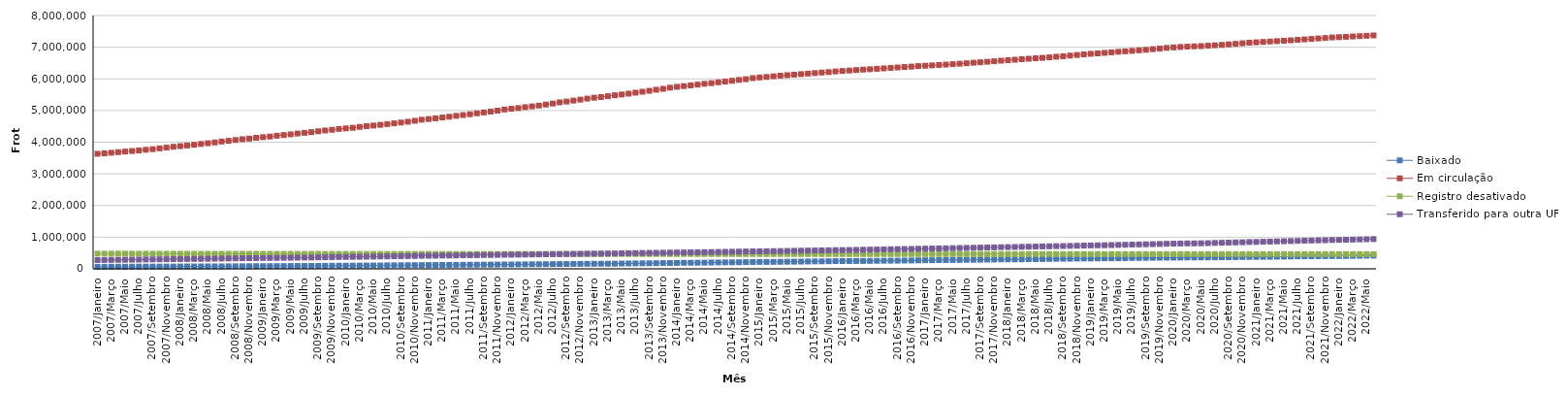
| Category | Baixado | Em circulação | Registro desativado | Transferido para outra UF |
|---|---|---|---|---|
| 2007/Janeiro | 64547 | 3632913 | 479318 | 276848 |
| 2007/Fevereiro | 64806 | 3648229 | 479069 | 278589 |
| 2007/Março | 65958 | 3666330 | 478732 | 281336 |
| 2007/Abril | 67104 | 3684659 | 478408 | 283482 |
| 2007/Maio | 67910 | 3703105 | 478111 | 286287 |
| 2007/Junho | 68357 | 3720760 | 477892 | 288677 |
| 2007/Julho | 68833 | 3740144 | 477650 | 291392 |
| 2007/Agosto | 69889 | 3760626 | 477365 | 294747 |
| 2007/Setembro | 70132 | 3780102 | 477124 | 297430 |
| 2007/Outubro | 71287 | 3804917 | 476840 | 300329 |
| 2007/Novembro | 72361 | 3829566 | 476562 | 302820 |
| 2007/Dezembro | 73891 | 3855215 | 476328 | 306596 |
| 2008/Janeiro | 74340 | 3875255 | 476076 | 308112 |
| 2008/Fevereiro | 75353 | 3894762 | 475708 | 310477 |
| 2008/Março | 75675 | 3918034 | 475517 | 313000 |
| 2008/Abril | 76548 | 3943442 | 475316 | 315593 |
| 2008/Maio | 77484 | 3966525 | 475140 | 318190 |
| 2008/Junho | 78077 | 3992143 | 474958 | 320898 |
| 2008/Julho | 78582 | 4020226 | 474670 | 324495 |
| 2008/Agosto | 79818 | 4043489 | 474450 | 327629 |
| 2008/Setembro | 81417 | 4069023 | 474182 | 330807 |
| 2008/Outubro | 82541 | 4093300 | 473971 | 333813 |
| 2008/Novembro | 84019 | 4112490 | 473775 | 336412 |
| 2008/Dezembro | 85156 | 4138550 | 473621 | 339835 |
| 2009/Janeiro | 85589 | 4157957 | 473439 | 341229 |
| 2009/Fevereiro | 85810 | 4177472 | 473325 | 342951 |
| 2009/Março | 86786 | 4203850 | 473151 | 345339 |
| 2009/Abril | 87201 | 4226174 | 473036 | 347728 |
| 2009/Maio | 88580 | 4247794 | 472889 | 350429 |
| 2009/Junho | 90837 | 4272968 | 472709 | 353099 |
| 2009/Julho | 92104 | 4294709 | 472576 | 356443 |
| 2009/Agosto | 92510 | 4317141 | 472442 | 359402 |
| 2009/Setembro | 94082 | 4344058 | 472278 | 362303 |
| 2009/Outubro | 95054 | 4369013 | 472137 | 365574 |
| 2009/Novembro | 97424 | 4390432 | 471956 | 368724 |
| 2009/Dezembro | 99897 | 4417646 | 471836 | 372932 |
| 2010/Janeiro | 100722 | 4435639 | 471726 | 374770 |
| 2010/Fevereiro | 101738 | 4453986 | 471639 | 377118 |
| 2010/Março | 103557 | 4483084 | 471523 | 380165 |
| 2010/Abril | 104790 | 4505426 | 471431 | 383245 |
| 2010/Maio | 106349 | 4525363 | 471326 | 386624 |
| 2010/Junho | 107893 | 4547457 | 471216 | 389555 |
| 2010/Julho | 110156 | 4570518 | 471118 | 392864 |
| 2010/Agosto | 112074 | 4594873 | 470979 | 396734 |
| 2010/Setembro | 113505 | 4620313 | 470821 | 400123 |
| 2010/Outubro | 115321 | 4645888 | 470695 | 403353 |
| 2010/Novembro | 116797 | 4674932 | 470572 | 406552 |
| 2010/Dezembro | 118610 | 4709614 | 470476 | 410966 |
| 2011/Janeiro | 119458 | 4730853 | 470334 | 412560 |
| 2011/Fevereiro | 120721 | 4753292 | 470223 | 415130 |
| 2011/Março | 122631 | 4779798 | 470113 | 417798 |
| 2011/Abril | 124288 | 4803932 | 469981 | 420366 |
| 2011/Maio | 126038 | 4830913 | 469848 | 423329 |
| 2011/Junho | 127706 | 4856554 | 469761 | 426350 |
| 2011/Julho | 129434 | 4882122 | 469687 | 429306 |
| 2011/Agosto | 131102 | 4911137 | 469586 | 432603 |
| 2011/Setembro | 132166 | 4939244 | 469509 | 435378 |
| 2011/Outubro | 133310 | 4967366 | 469435 | 437826 |
| 2011/Novembro | 134951 | 4997208 | 469335 | 440813 |
| 2011/Dezembro | 137543 | 5031931 | 469234 | 444680 |
| 2012/Janeiro | 139003 | 5055710 | 469149 | 446486 |
| 2012/Fevereiro | 140447 | 5078339 | 469080 | 448559 |
| 2012/Março | 142361 | 5106022 | 469058 | 451330 |
| 2012/Abril | 143914 | 5130446 | 469011 | 454018 |
| 2012/Maio | 145749 | 5155775 | 468931 | 457354 |
| 2012/Junho | 147258 | 5188180 | 468880 | 460047 |
| 2012/Julho | 149231 | 5219958 | 468795 | 462989 |
| 2012/Agosto | 151529 | 5257687 | 468716 | 465907 |
| 2012/Setembro | 152295 | 5282590 | 468654 | 468538 |
| 2012/Outubro | 154976 | 5313490 | 468590 | 471300 |
| 2012/Novembro | 156239 | 5344017 | 468540 | 473891 |
| 2012/Dezembro | 158685 | 5376302 | 468491 | 477243 |
| 2013/Janeiro | 159483 | 5404062 | 468426 | 479111 |
| 2013/Fevereiro | 160275 | 5424928 | 468389 | 481426 |
| 2013/Março | 161004 | 5453090 | 468350 | 484385 |
| 2013/Abril | 162630 | 5481312 | 468294 | 487380 |
| 2013/Maio | 167646 | 5506402 | 468237 | 490627 |
| 2013/Junho | 170054 | 5532795 | 468175 | 493935 |
| 2013/Julho | 172029 | 5563568 | 468111 | 497157 |
| 2013/Agosto | 173685 | 5593637 | 468066 | 500382 |
| 2013/Setembro | 175709 | 5622382 | 468025 | 503497 |
| 2013/Outubro | 178214 | 5656250 | 467984 | 506434 |
| 2013/Novembro | 180788 | 5684377 | 467929 | 509626 |
| 2013/Dezembro | 184184 | 5721904 | 467875 | 513337 |
| 2014/Janeiro | 186846 | 5748128 | 467833 | 515333 |
| 2014/Fevereiro | 189515 | 5770821 | 467796 | 518027 |
| 2014/Março | 191304 | 5793196 | 467765 | 520651 |
| 2014/Abril | 193693 | 5818542 | 467723 | 523579 |
| 2014/Maio | 196272 | 5843746 | 467685 | 527000 |
| 2014/Junho | 199573 | 5864261 | 467646 | 529836 |
| 2014/Julho | 201022 | 5890833 | 467613 | 533249 |
| 2014/Agosto | 204061 | 5913467 | 467568 | 536683 |
| 2014/Setembro | 206262 | 5939059 | 467520 | 540552 |
| 2014/Outubro | 207813 | 5966949 | 467458 | 544181 |
| 2014/Novembro | 211568 | 5989921 | 467415 | 547751 |
| 2014/Dezembro | 215162 | 6023696 | 467379 | 551647 |
| 2015/Janeiro | 217028 | 6044109 | 467345 | 553753 |
| 2015/Fevereiro | 218402 | 6060017 | 467305 | 556020 |
| 2015/Março | 219202 | 6081464 | 467278 | 558986 |
| 2015/Abril | 221394 | 6099731 | 467220 | 561996 |
| 2015/Maio | 224189 | 6116019 | 467185 | 565316 |
| 2015/Junho | 226275 | 6133070 | 467157 | 569023 |
| 2015/Julho | 229671 | 6149545 | 467059 | 573130 |
| 2015/Agosto | 231894 | 6166087 | 467023 | 576564 |
| 2015/Setembro | 234445 | 6182695 | 466986 | 579626 |
| 2015/Outubro | 236872 | 6199190 | 466943 | 582841 |
| 2015/Novembro | 240183 | 6214097 | 466913 | 586213 |
| 2015/Dezembro | 243927 | 6234770 | 466852 | 590382 |
| 2016/Janeiro | 245522 | 6248738 | 466827 | 592162 |
| 2016/Fevereiro | 246210 | 6262325 | 466802 | 594690 |
| 2016/Março | 247086 | 6278190 | 466775 | 598635 |
| 2016/Abril | 248683 | 6291879 | 466753 | 602485 |
| 2016/Maio | 251402 | 6303625 | 466728 | 606619 |
| 2016/Junho | 254051 | 6316998 | 466687 | 610546 |
| 2016/Julho | 255817 | 6330862 | 466660 | 614355 |
| 2016/Agosto | 257432 | 6345911 | 466628 | 618536 |
| 2016/Setembro | 258603 | 6359838 | 466602 | 622208 |
| 2016/Outubro | 261598 | 6372980 | 466570 | 625399 |
| 2016/Novembro | 264004 | 6386619 | 466542 | 629511 |
| 2016/Dezembro | 267778 | 6403542 | 466489 | 634447 |
| 2017/Janeiro | 270891 | 6414460 | 466453 | 637238 |
| 2017/Fevereiro | 272063 | 6425504 | 466433 | 640595 |
| 2017/Março | 275070 | 6439097 | 466401 | 644880 |
| 2017/Abril | 277340 | 6450292 | 466370 | 648542 |
| 2017/Maio | 279411 | 6464460 | 466342 | 652957 |
| 2017/Junho | 282084 | 6477985 | 466311 | 657295 |
| 2017/Julho | 283962 | 6492839 | 466292 | 661514 |
| 2017/Agosto | 286001 | 6509645 | 466269 | 666061 |
| 2017/Setembro | 289241 | 6523605 | 466241 | 670058 |
| 2017/Outubro | 291528 | 6539876 | 466216 | 674079 |
| 2017/Novembro | 293876 | 6556469 | 466194 | 678051 |
| 2017/Dezembro | 297459 | 6574700 | 466163 | 683407 |
| 2018/Janeiro | 298212 | 6590826 | 466146 | 686456 |
| 2018/Fevereiro | 299515 | 6604032 | 466121 | 689793 |
| 2018/Março | 301924 | 6620257 | 466106 | 693866 |
| 2018/Abril | 305125 | 6635037 | 466100 | 698484 |
| 2018/Maio | 307134 | 6650360 | 466084 | 703240 |
| 2018/Junho | 311033 | 6663398 | 466070 | 707342 |
| 2018/Julho | 313627 | 6679835 | 466056 | 711632 |
| 2018/Agosto | 316765 | 6698043 | 466038 | 716178 |
| 2018/Setembro | 319461 | 6713951 | 466018 | 720299 |
| 2018/Outubro | 321660 | 6734626 | 466004 | 724869 |
| 2018/Novembro | 324093 | 6753405 | 465986 | 729042 |
| 2018/Dezembro | 326366 | 6772764 | 465972 | 734711 |
| 2019/Janeiro | 327423 | 6790625 | 465953 | 738051 |
| 2019/Fevereiro | 329537 | 6805350 | 465935 | 742376 |
| 2019/Março | 331558 | 6819940 | 465923 | 746320 |
| 2019/Abril | 333812 | 6837406 | 465911 | 750807 |
| 2019/Maio | 335375 | 6855139 | 465895 | 756069 |
| 2019/Junho | 338802 | 6868961 | 465874 | 760496 |
| 2019/Julho | 342323 | 6884629 | 465851 | 765597 |
| 2019/Agosto | 344965 | 6901309 | 465822 | 770563 |
| 2019/Setembro | 347619 | 6917855 | 465822 | 775237 |
| 2019/Outubro | 349718 | 6938080 | 465806 | 780181 |
| 2019/Novembro | 350970 | 6955582 | 465782 | 785458 |
| 2019/Dezembro | 352965 | 6977604 | 465765 | 791558 |
| 2020/Janeiro | 354489 | 6993809 | 465743 | 795025 |
| 2020/Fevereiro | 356147 | 7007299 | 465715 | 799245 |
| 2020/Março | 358271 | 7017800 | 465698 | 802476 |
| 2020/Abril | 359104 | 7025685 | 465695 | 803411 |
| 2020/Maio | 360905 | 7034398 | 465673 | 806772 |
| 2020/Junho | 361785 | 7046336 | 465663 | 811197 |
| 2020/Julho | 363737 | 7058503 | 465630 | 817382 |
| 2020/Agosto | 366053 | 7072187 | 465612 | 822817 |
| 2020/Setembro | 368272 | 7089198 | 465602 | 828132 |
| 2020/Outubro | 370945 | 7106270 | 465584 | 833959 |
| 2020/Novembro | 372976 | 7123342 | 465560 | 839430 |
| 2020/Dezembro | 376228 | 7141018 | 465548 | 847035 |
| 2021/Janeiro | 377555 | 7154202 | 465534 | 850390 |
| 2021/Fevereiro | 379405 | 7166783 | 465522 | 855047 |
| 2021/Março | 380932 | 7179662 | 465495 | 860741 |
| 2021/Abril | 383163 | 7191840 | 465472 | 866135 |
| 2021/Maio | 386946 | 7204292 | 465446 | 871834 |
| 2021/Junho | 390338 | 7217202 | 465420 | 877449 |
| 2021/Julho | 393298 | 7231674 | 465394 | 883283 |
| 2021/Agosto | 395853 | 7246464 | 465378 | 888932 |
| 2021/Setembro | 397391 | 7262038 | 465366 | 893961 |
| 2021/Outubro | 399445 | 7276487 | 465355 | 899094 |
| 2021/Novembro | 401139 | 7291245 | 465330 | 904371 |
| 2021/Dezembro | 402824 | 7308202 | 465309 | 911205 |
| 2022/Janeiro | 404369 | 7317463 | 465282 | 914677 |
| 2022/Fevereiro | 405982 | 7327786 | 465272 | 918882 |
| 2022/Março | 408560 | 7338858 | 465197 | 924029 |
| 2022/Abril | 410812 | 7349180 | 465171 | 929047 |
| 2022/Maio | 414919 | 7360072 | 465151 | 934909 |
| 2022/Junho | 417314 | 7371801 | 465119 | 940156 |